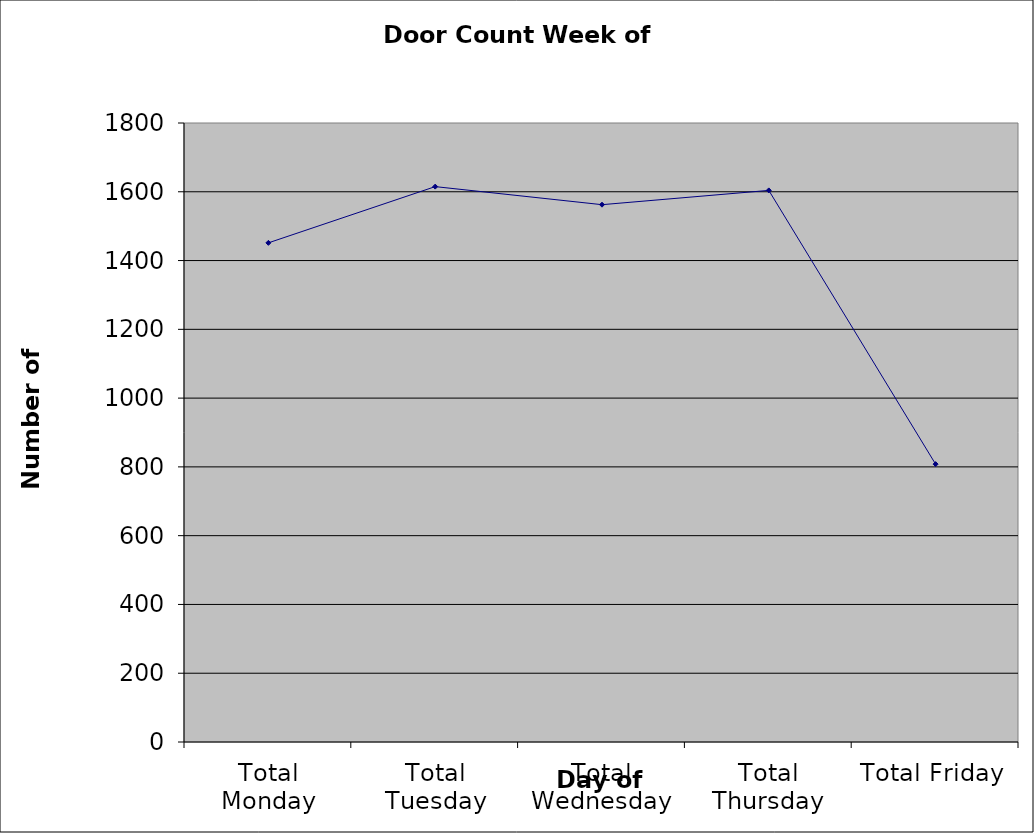
| Category | Series 0 |
|---|---|
| Total Monday | 1451.5 |
| Total Tuesday | 1615 |
| Total Wednesday | 1562.5 |
| Total Thursday | 1604 |
| Total Friday | 808 |